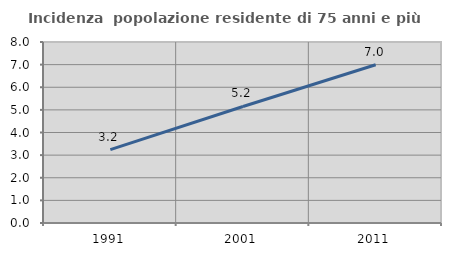
| Category | Incidenza  popolazione residente di 75 anni e più |
|---|---|
| 1991.0 | 3.244 |
| 2001.0 | 5.15 |
| 2011.0 | 6.993 |